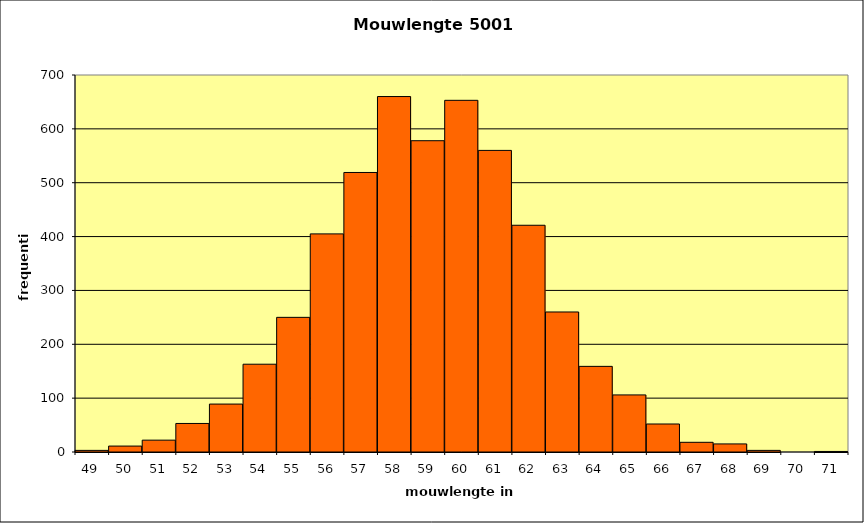
| Category | Series 1 |
|---|---|
| 49.0 | 3 |
| 50.0 | 11 |
| 51.0 | 22 |
| 52.0 | 53 |
| 53.0 | 89 |
| 54.0 | 163 |
| 55.0 | 250 |
| 56.0 | 405 |
| 57.0 | 519 |
| 58.0 | 660 |
| 59.0 | 578 |
| 60.0 | 653 |
| 61.0 | 560 |
| 62.0 | 421 |
| 63.0 | 260 |
| 64.0 | 159 |
| 65.0 | 106 |
| 66.0 | 52 |
| 67.0 | 18 |
| 68.0 | 15 |
| 69.0 | 3 |
| 70.0 | 0 |
| 71.0 | 1 |